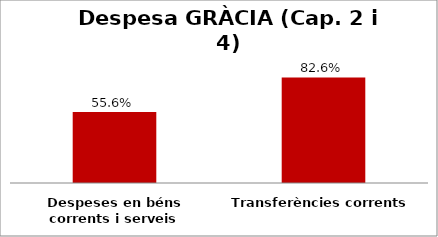
| Category | Series 0 |
|---|---|
| Despeses en béns corrents i serveis | 0.556 |
| Transferències corrents | 0.826 |